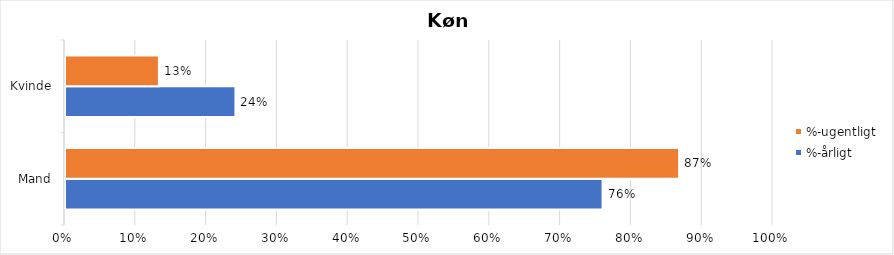
| Category | %-årligt | %-ugentligt |
|---|---|---|
| Mand | 0.759 | 0.867 |
| Kvinde | 0.241 | 0.133 |